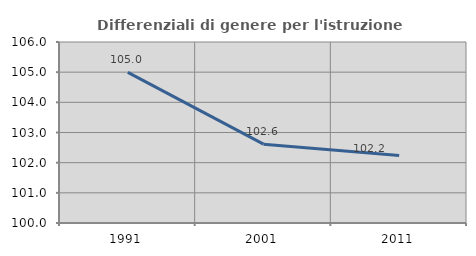
| Category | Differenziali di genere per l'istruzione superiore |
|---|---|
| 1991.0 | 104.992 |
| 2001.0 | 102.614 |
| 2011.0 | 102.236 |